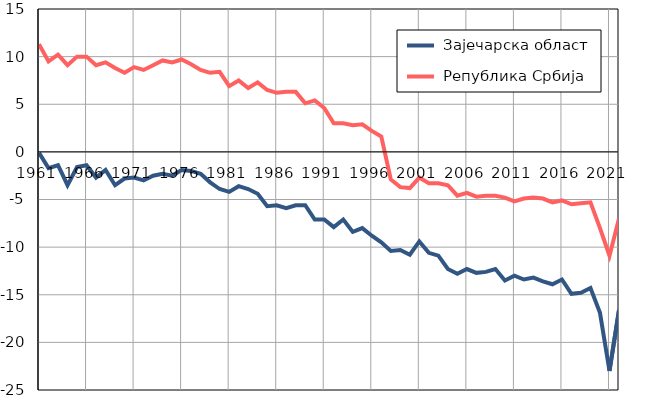
| Category |  Зајечарска област |  Република Србија |
|---|---|---|
| 1961.0 | -0.1 | 11.3 |
| 1962.0 | -1.7 | 9.5 |
| 1963.0 | -1.4 | 10.2 |
| 1964.0 | -3.5 | 9.1 |
| 1965.0 | -1.6 | 10 |
| 1966.0 | -1.4 | 10 |
| 1967.0 | -2.7 | 9.1 |
| 1968.0 | -1.9 | 9.4 |
| 1969.0 | -3.5 | 8.8 |
| 1970.0 | -2.8 | 8.3 |
| 1971.0 | -2.7 | 8.9 |
| 1972.0 | -3 | 8.6 |
| 1973.0 | -2.5 | 9.1 |
| 1974.0 | -2.3 | 9.6 |
| 1975.0 | -2.5 | 9.4 |
| 1976.0 | -1.9 | 9.7 |
| 1977.0 | -2 | 9.2 |
| 1978.0 | -2.3 | 8.6 |
| 1979.0 | -3.2 | 8.3 |
| 1980.0 | -3.9 | 8.4 |
| 1981.0 | -4.2 | 6.9 |
| 1982.0 | -3.6 | 7.5 |
| 1983.0 | -3.9 | 6.7 |
| 1984.0 | -4.4 | 7.3 |
| 1985.0 | -5.7 | 6.5 |
| 1986.0 | -5.6 | 6.2 |
| 1987.0 | -5.9 | 6.3 |
| 1988.0 | -5.6 | 6.3 |
| 1989.0 | -5.6 | 5.1 |
| 1990.0 | -7.1 | 5.4 |
| 1991.0 | -7.1 | 4.6 |
| 1992.0 | -7.9 | 3 |
| 1993.0 | -7.1 | 3 |
| 1994.0 | -8.4 | 2.8 |
| 1995.0 | -8 | 2.9 |
| 1996.0 | -8.8 | 2.2 |
| 1997.0 | -9.5 | 1.6 |
| 1998.0 | -10.4 | -2.9 |
| 1999.0 | -10.3 | -3.7 |
| 2000.0 | -10.8 | -3.8 |
| 2001.0 | -9.4 | -2.7 |
| 2002.0 | -10.6 | -3.3 |
| 2003.0 | -10.9 | -3.3 |
| 2004.0 | -12.3 | -3.5 |
| 2005.0 | -12.8 | -4.6 |
| 2006.0 | -12.3 | -4.3 |
| 2007.0 | -12.7 | -4.7 |
| 2008.0 | -12.6 | -4.6 |
| 2009.0 | -12.3 | -4.6 |
| 2010.0 | -13.5 | -4.8 |
| 2011.0 | -13 | -5.2 |
| 2012.0 | -13.4 | -4.9 |
| 2013.0 | -13.2 | -4.8 |
| 2014.0 | -13.6 | -4.9 |
| 2015.0 | -13.9 | -5.3 |
| 2016.0 | -13.4 | -5.1 |
| 2017.0 | -14.9 | -5.5 |
| 2018.0 | -14.8 | -5.4 |
| 2019.0 | -14.3 | -5.3 |
| 2020.0 | -16.9 | -8 |
| 2021.0 | -23 | -10.9 |
| 2022.0 | -16.6 | -7 |